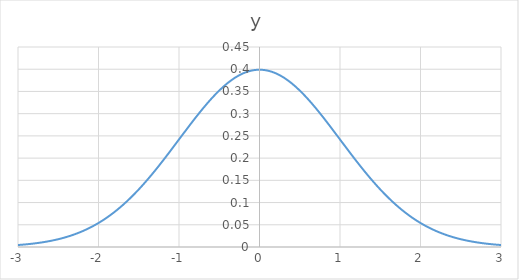
| Category | y |
|---|---|
| -3.0 | 0.004 |
| -2.9 | 0.006 |
| -2.8 | 0.008 |
| -2.6999999999999997 | 0.01 |
| -2.5999999999999996 | 0.014 |
| -2.4999999999999996 | 0.018 |
| -2.3999999999999995 | 0.022 |
| -2.2999999999999994 | 0.028 |
| -2.1999999999999993 | 0.035 |
| -2.099999999999999 | 0.044 |
| -1.9999999999999991 | 0.054 |
| -1.899999999999999 | 0.066 |
| -1.799999999999999 | 0.079 |
| -1.6999999999999988 | 0.094 |
| -1.5999999999999988 | 0.111 |
| -1.4999999999999987 | 0.13 |
| -1.3999999999999986 | 0.15 |
| -1.2999999999999985 | 0.171 |
| -1.1999999999999984 | 0.194 |
| -1.0999999999999983 | 0.218 |
| -0.9999999999999983 | 0.242 |
| -0.8999999999999984 | 0.266 |
| -0.7999999999999984 | 0.29 |
| -0.6999999999999984 | 0.312 |
| -0.5999999999999984 | 0.333 |
| -0.49999999999999845 | 0.352 |
| -0.39999999999999847 | 0.368 |
| -0.2999999999999985 | 0.381 |
| -0.19999999999999848 | 0.391 |
| -0.09999999999999848 | 0.397 |
| 1.5265566588595902e-15 | 0.399 |
| 0.10000000000000153 | 0.397 |
| 0.20000000000000154 | 0.391 |
| 0.30000000000000154 | 0.381 |
| 0.4000000000000016 | 0.368 |
| 0.5000000000000016 | 0.352 |
| 0.6000000000000015 | 0.333 |
| 0.7000000000000015 | 0.312 |
| 0.8000000000000015 | 0.29 |
| 0.9000000000000015 | 0.266 |
| 1.0000000000000016 | 0.242 |
| 1.1000000000000016 | 0.218 |
| 1.2000000000000017 | 0.194 |
| 1.3000000000000018 | 0.171 |
| 1.400000000000002 | 0.15 |
| 1.500000000000002 | 0.13 |
| 1.600000000000002 | 0.111 |
| 1.7000000000000022 | 0.094 |
| 1.8000000000000023 | 0.079 |
| 1.9000000000000024 | 0.066 |
| 2.000000000000002 | 0.054 |
| 2.1000000000000023 | 0.044 |
| 2.2000000000000024 | 0.035 |
| 2.3000000000000025 | 0.028 |
| 2.4000000000000026 | 0.022 |
| 2.5000000000000027 | 0.018 |
| 2.6000000000000028 | 0.014 |
| 2.700000000000003 | 0.01 |
| 2.800000000000003 | 0.008 |
| 2.900000000000003 | 0.006 |
| 3.000000000000003 | 0.004 |